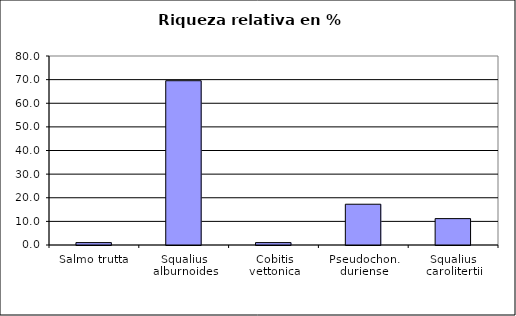
| Category | Series 0 |
|---|---|
| Salmo trutta | 1.015 |
| Squalius alburnoides | 69.543 |
| Cobitis vettonica | 1.015 |
| Pseudochon. duriense | 17.259 |
| Squalius carolitertii | 11.168 |